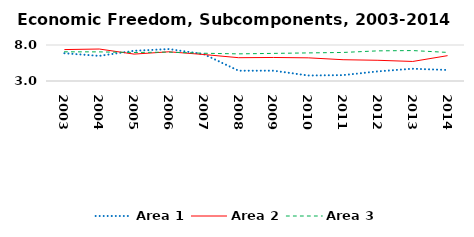
| Category | Area 1 | Area 2 | Area 3 |
|---|---|---|---|
| 2003.0 | 6.858 | 7.364 | 7.053 |
| 2004.0 | 6.488 | 7.44 | 7.044 |
| 2005.0 | 7.194 | 6.737 | 6.96 |
| 2006.0 | 7.435 | 7.056 | 7.01 |
| 2007.0 | 6.726 | 6.679 | 6.854 |
| 2008.0 | 4.431 | 6.237 | 6.768 |
| 2009.0 | 4.433 | 6.267 | 6.835 |
| 2010.0 | 3.766 | 6.216 | 6.901 |
| 2011.0 | 3.816 | 5.957 | 6.964 |
| 2012.0 | 4.339 | 5.876 | 7.187 |
| 2013.0 | 4.704 | 5.714 | 7.226 |
| 2014.0 | 4.527 | 6.522 | 6.971 |